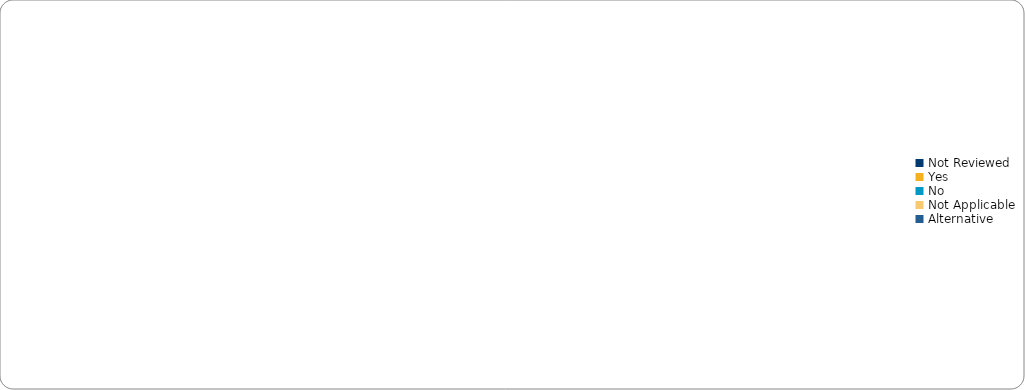
| Category | Counts |
|---|---|
| Not Reviewed | 0 |
| Yes | 0 |
| No | 0 |
| Not Applicable | 0 |
| Alternative | 0 |